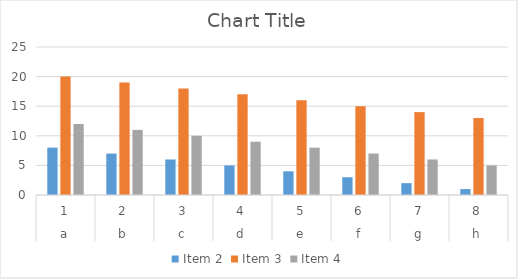
| Category | Item 2 | Item 3 | Item 4 |
|---|---|---|---|
| 0 | 8 | 20 | 12 |
| 1 | 7 | 19 | 11 |
| 2 | 6 | 18 | 10 |
| 3 | 5 | 17 | 9 |
| 4 | 4 | 16 | 8 |
| 5 | 3 | 15 | 7 |
| 6 | 2 | 14 | 6 |
| 7 | 1 | 13 | 5 |